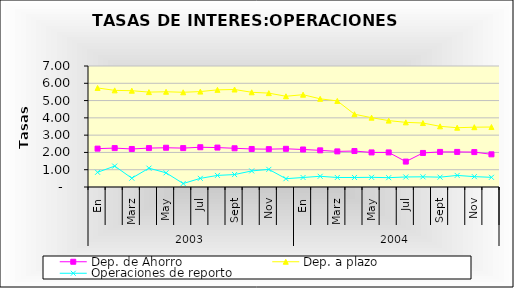
| Category | Dep. de Ahorro | Dep. a plazo | Operaciones de reporto |
|---|---|---|---|
| 0 | 2.22 | 5.73 | 0.85 |
| 1 | 2.25 | 5.59 | 1.21 |
| 2 | 2.2 | 5.57 | 0.51 |
| 3 | 2.25 | 5.49 | 1.09 |
| 4 | 2.27 | 5.51 | 0.82 |
| 5 | 2.25 | 5.48 | 0.2 |
| 6 | 2.3 | 5.52 | 0.5 |
| 7 | 2.28 | 5.62 | 0.67 |
| 8 | 2.24 | 5.64 | 0.72 |
| 9 | 2.2 | 5.48 | 0.93 |
| 10 | 2.19 | 5.43 | 1.02 |
| 11 | 2.21 | 5.25 | 0.48 |
| 12 | 2.17 | 5.34 | 0.55 |
| 13 | 2.12 | 5.1 | 0.62 |
| 14 | 2.06 | 4.98 | 0.55 |
| 15 | 2.08 | 4.21 | 0.55 |
| 16 | 2 | 4.01 | 0.56 |
| 17 | 2 | 3.84 | 0.54 |
| 18 | 1.47 | 3.74 | 0.58 |
| 19 | 1.97 | 3.7 | 0.59 |
| 20 | 2.03 | 3.51 | 0.57 |
| 21 | 2.03 | 3.43 | 0.67 |
| 22 | 2.02 | 3.46 | 0.6 |
| 23 | 1.89 | 3.47 | 0.56 |